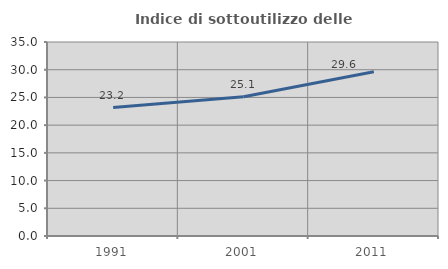
| Category | Indice di sottoutilizzo delle abitazioni  |
|---|---|
| 1991.0 | 23.174 |
| 2001.0 | 25.105 |
| 2011.0 | 29.646 |